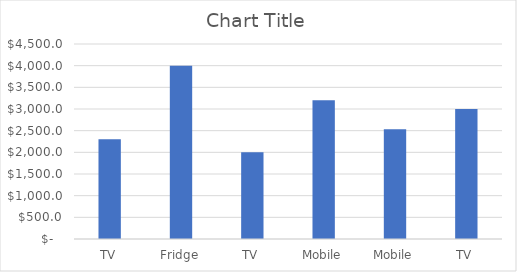
| Category | Series 0 |
|---|---|
| TV | 2300 |
| Fridge | 4000 |
| TV | 2000 |
| Mobile | 3200 |
| Mobile | 2530 |
| TV | 3000 |